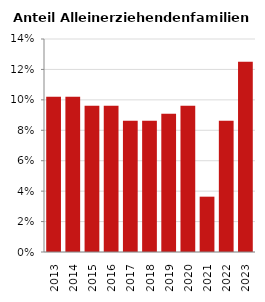
| Category | Anteil Alleinerziehende an Familien |
|---|---|
| 2013.0 | 0.102 |
| 2014.0 | 0.102 |
| 2015.0 | 0.096 |
| 2016.0 | 0.096 |
| 2017.0 | 0.086 |
| 2018.0 | 0.086 |
| 2019.0 | 0.091 |
| 2020.0 | 0.096 |
| 2021.0 | 0.036 |
| 2022.0 | 0.086 |
| 2023.0 | 0.125 |